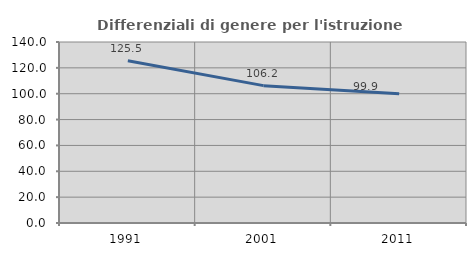
| Category | Differenziali di genere per l'istruzione superiore |
|---|---|
| 1991.0 | 125.475 |
| 2001.0 | 106.241 |
| 2011.0 | 99.93 |